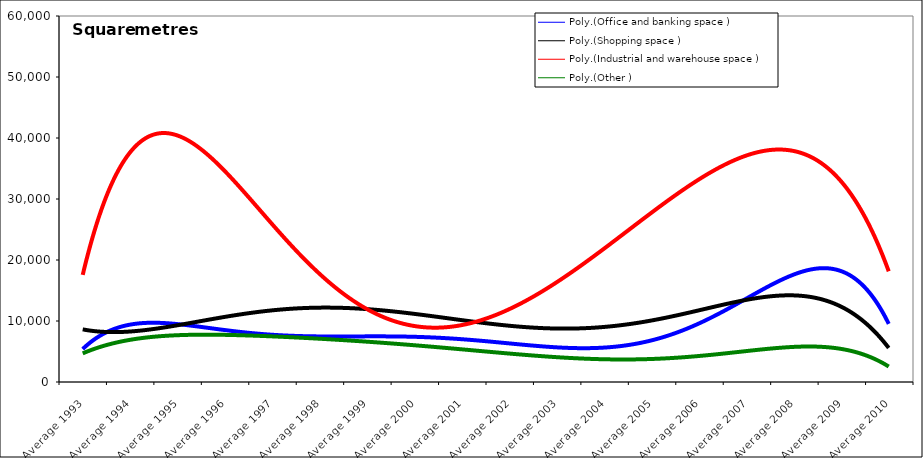
| Category | Office and banking space | Shopping space | Industrial and warehouse space | Other |
|---|---|---|---|---|
| Average 1993 | 3840.083 | 7911.75 | 19273.167 | 4569 |
| Average 1994 | 14243.75 | 9089 | 29577.667 | 7634.167 |
| Average 1995 | 5982.917 | 12454.333 | 51713.583 | 6208.583 |
| Average 1996 | 7401 | 6991.167 | 33714.917 | 8724.417 |
| Average 1997 | 8324.833 | 9341.167 | 19005.25 | 7786.417 |
| Average 1998 | 7065.167 | 8364.5 | 18962.167 | 6520.667 |
| Average 1999 | 9990.25 | 26515.833 | 8909.75 | 7421.75 |
| Average 2000 | 4690.667 | 7060.75 | 14173.083 | 4495.833 |
| Average 2001 | 11529.75 | 3186 | 11034 | 5105.417 |
| Average 2002 | 4412.583 | 10516.583 | 13680.167 | 7202.417 |
| Average 2003 | 2711.083 | 11288.083 | 14080.917 | 2677.583 |
| Average 2004 | 6691.417 | 7099.083 | 15809 | 3761.583 |
| Average 2005 | 5342.583 | 13125.25 | 30065.667 | 2859.917 |
| Average 2006 | 13978.25 | 9684.833 | 37507.5 | 4979.5 |
| Average 2007 | 10468 | 12652.167 | 32661.917 | 5926.75 |
| Average 2008 | 20702.417 | 16911.417 | 44614.75 | 4597.167 |
| Average 2009 | 15222.167 | 10115.917 | 26641.917 | 5877.083 |
| Average 2010 | 10313.25 | 6074.625 | 19694.125 | 2411.125 |